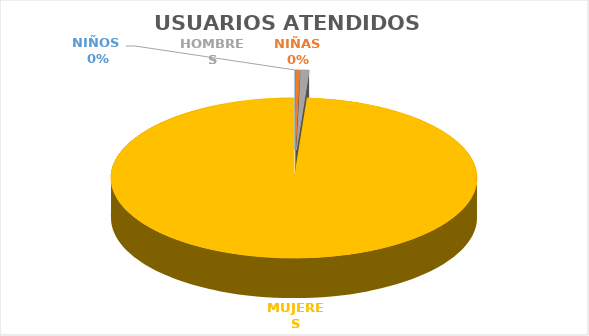
| Category | USUARIOS ATENDIDOS  |
|---|---|
| NIÑOS  | 0 |
| NIÑAS | 2 |
| HOMBRES | 4 |
| MUJERES | 531 |